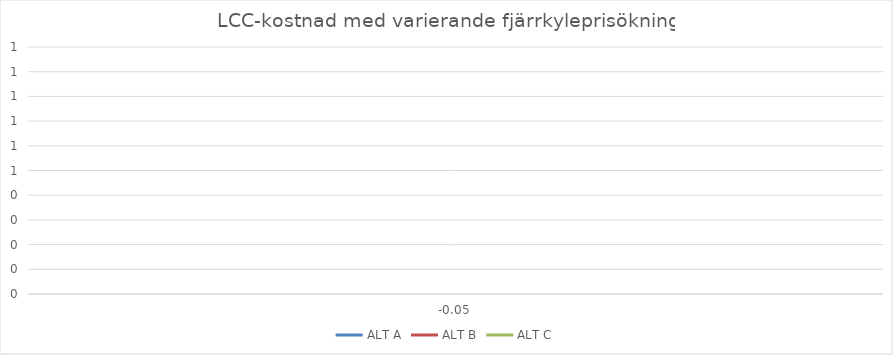
| Category | ALT A | ALT B | ALT C |
|---|---|---|---|
| -0.05 | 0 | 0 | 0 |
| -0.04 | 0 | 0 | 0 |
| -0.03 | 0 | 0 | 0 |
| -0.02 | 0 | 0 | 0 |
| -0.01 | 0 | 0 | 0 |
| 0.0 | 0 | 0 | 0 |
| 0.01 | 0 | 0 | 0 |
| 0.02 | 0 | 0 | 0 |
| 0.03 | 0 | 0 | 0 |
| 0.04 | 0 | 0 | 0 |
| 0.05 | 0 | 0 | 0 |